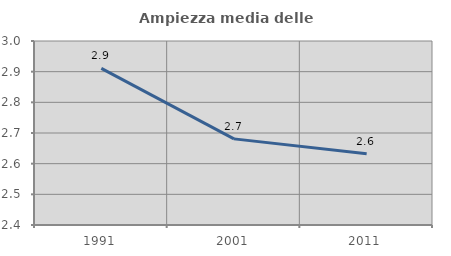
| Category | Ampiezza media delle famiglie |
|---|---|
| 1991.0 | 2.911 |
| 2001.0 | 2.681 |
| 2011.0 | 2.633 |